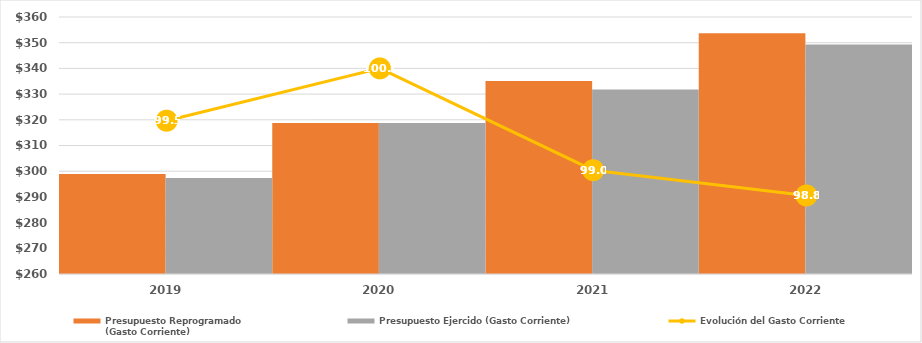
| Category | Presupuesto Reprogramado
(Gasto Corriente) | Presupuesto Ejercido (Gasto Corriente) |
|---|---|---|
| 2019.0 | 298904.428 | 297383.7 |
| 2020.0 | 318785.247 | 318785.247 |
| 2021.0 | 335107.39 | 331789.211 |
| 2022.0 | 353691.561 | 349320.095 |